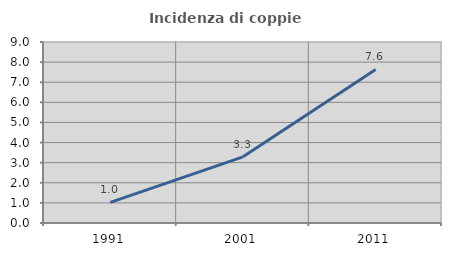
| Category | Incidenza di coppie miste |
|---|---|
| 1991.0 | 1.029 |
| 2001.0 | 3.288 |
| 2011.0 | 7.637 |